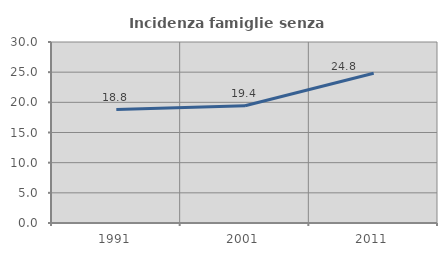
| Category | Incidenza famiglie senza nuclei |
|---|---|
| 1991.0 | 18.801 |
| 2001.0 | 19.442 |
| 2011.0 | 24.824 |